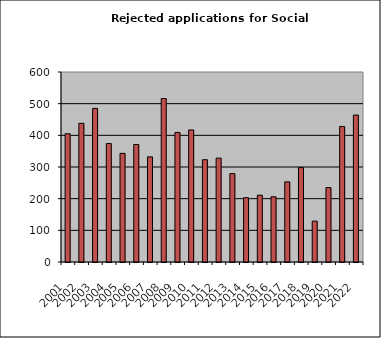
| Category | Series 1 |
|---|---|
| 2001.0 | 405 |
| 2002.0 | 438 |
| 2003.0 | 485 |
| 2004.0 | 374 |
| 2005.0 | 343 |
| 2006.0 | 371 |
| 2007.0 | 332 |
| 2008.0 | 516 |
| 2009.0 | 409 |
| 2010.0 | 417 |
| 2011.0 | 323 |
| 2012.0 | 328 |
| 2013.0 | 279 |
| 2014.0 | 203 |
| 2015.0 | 211 |
| 2016.0 | 206 |
| 2017.0 | 253 |
| 2018.0 | 298 |
| 2019.0 | 129 |
| 2020.0 | 235 |
| 2021.0 | 428 |
| 2022.0 | 464 |